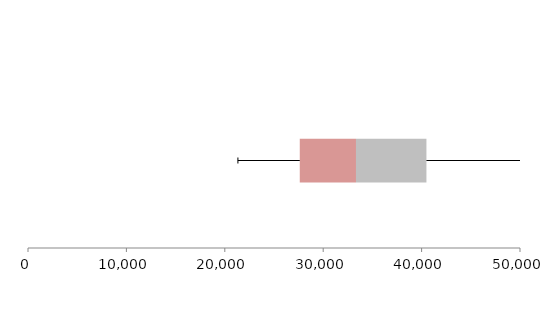
| Category | Series 1 | Series 2 | Series 3 |
|---|---|---|---|
| 0 | 27619.123 | 5712.819 | 7160.019 |